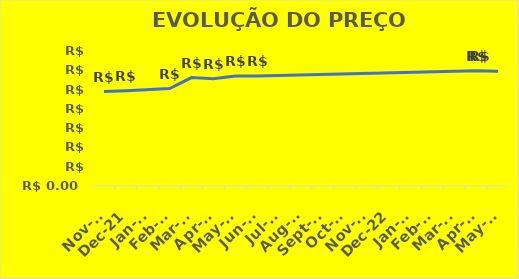
| Category | Series 0 |
|---|---|
| 2021-11-01 | 489.38 |
| 2021-12-01 | 493.35 |
| 2022-02-01 | 505.43 |
| 2022-03-01 | 562.35 |
| 2022-04-01 | 556.13 |
| 2022-05-01 | 569.8 |
| 2022-06-01 | 570.84 |
| 2023-04-08 | 597.46 |
| 2023-05-08 | 594.38 |